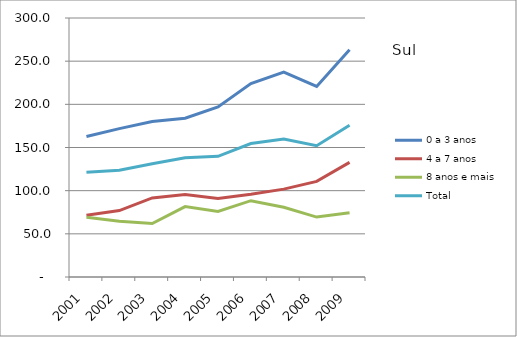
| Category | 0 a 3 anos | 4 a 7 anos | 8 anos e mais | Total |
|---|---|---|---|---|
| 2001.0 | 162.7 | 71.6 | 69.2 | 121.4 |
| 2002.0 | 171.9 | 76.9 | 64.7 | 123.7 |
| 2003.0 | 180 | 91.6 | 61.9 | 131.2 |
| 2004.0 | 183.9 | 95.5 | 81.6 | 138 |
| 2005.0 | 196.9 | 90.9 | 75.9 | 139.8 |
| 2006.0 | 224 | 95.9 | 88.4 | 154.6 |
| 2007.0 | 237.4 | 101.8 | 80.7 | 159.8 |
| 2008.0 | 220.7 | 110.8 | 69.4 | 152 |
| 2009.0 | 263.3 | 132.8 | 74.3 | 175.7 |